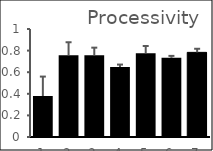
| Category | Series 0 |
|---|---|
| 0 | 0.38 |
| 1 | 0.757 |
| 2 | 0.756 |
| 3 | 0.648 |
| 4 | 0.776 |
| 5 | 0.733 |
| 6 | 0.784 |